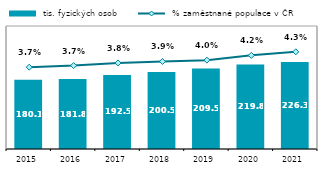
| Category |  tis. fyzických osob |
|---|---|
| 2015.0 | 180.104 |
| 2016.0 | 181.802 |
| 2017.0 | 192.542 |
| 2018.0 | 200.508 |
| 2019.0 | 209.525 |
| 2020.0 | 219.767 |
| 2021.0 | 226.275 |